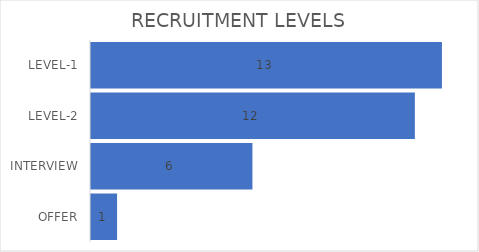
| Category | OFFSETTER | Series 0 |
|---|---|---|
| LEVEL-1 |  | 13 |
| LEVEL-2 |  | 12 |
| INTERVIEW |  | 6 |
| OFFER |  | 1 |